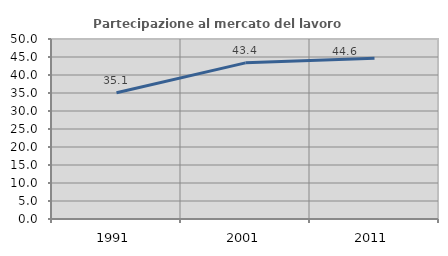
| Category | Partecipazione al mercato del lavoro  femminile |
|---|---|
| 1991.0 | 35.071 |
| 2001.0 | 43.377 |
| 2011.0 | 44.628 |